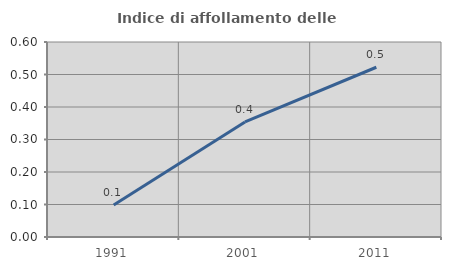
| Category | Indice di affollamento delle abitazioni  |
|---|---|
| 1991.0 | 0.098 |
| 2001.0 | 0.354 |
| 2011.0 | 0.522 |